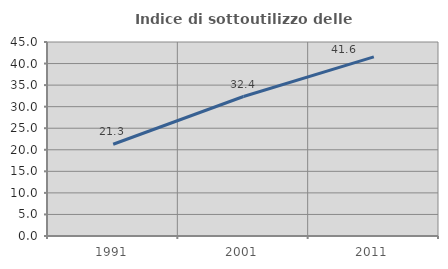
| Category | Indice di sottoutilizzo delle abitazioni  |
|---|---|
| 1991.0 | 21.275 |
| 2001.0 | 32.358 |
| 2011.0 | 41.555 |